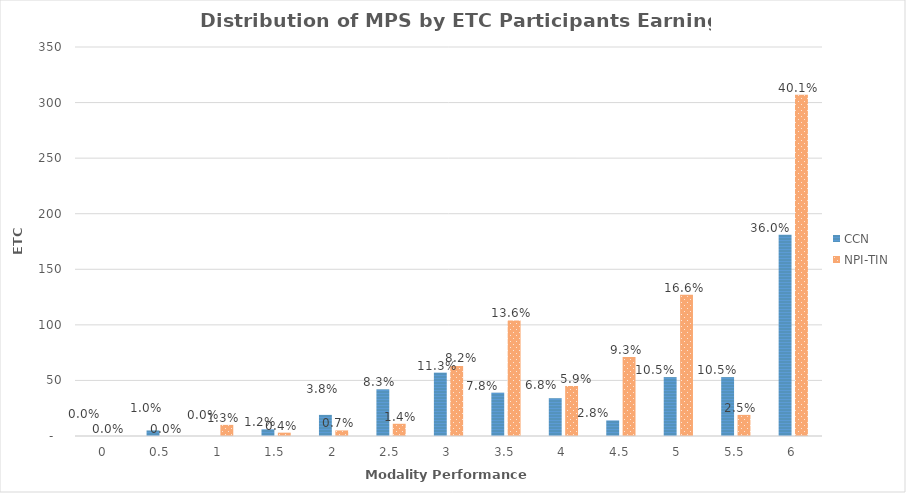
| Category | CCN | NPI-TIN |
|---|---|---|
| 0.0 | 0 | 0 |
| 0.5 | 5 | 0 |
| 1.0 | 0 | 10 |
| 1.5 | 6 | 3 |
| 2.0 | 19 | 5 |
| 2.5 | 42 | 11 |
| 3.0 | 57 | 63 |
| 3.5 | 39 | 104 |
| 4.0 | 34 | 45 |
| 4.5 | 14 | 71 |
| 5.0 | 53 | 127 |
| 5.5 | 53 | 19 |
| 6.0 | 181 | 307 |